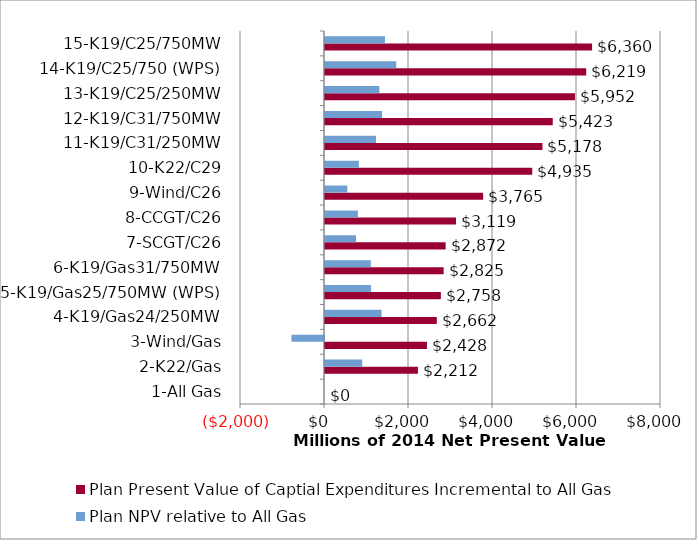
| Category | Plan Present Value of Captial Expenditures Incremental to All Gas | Plan NPV relative to All Gas |
|---|---|---|
| 1-All Gas | 0 | 0 |
| 2-K22/Gas | 2212.128 | 887.02 |
| 3-Wind/Gas | 2427.807 | -775.269 |
| 4-K19/Gas24/250MW | 2661.538 | 1346.484 |
| 5-K19/Gas25/750MW (WPS) | 2758.345 | 1096.581 |
| 6-K19/Gas31/750MW | 2825.107 | 1090.867 |
| 7-SCGT/C26 | 2872.231 | 738.216 |
| 8-CCGT/C26 | 3119.166 | 783.571 |
| 9-Wind/C26 | 3765.024 | 530.877 |
| 10-K22/C29 | 4935.163 | 805.892 |
| 11-K19/C31/250MW | 5177.903 | 1215.116 |
| 12-K19/C31/750MW | 5422.959 | 1360.084 |
| 13-K19/C25/250MW | 5952.005 | 1294.541 |
| 14-K19/C25/750 (WPS) | 6219.003 | 1695.975 |
| 15-K19/C25/750MW | 6359.624 | 1426.603 |